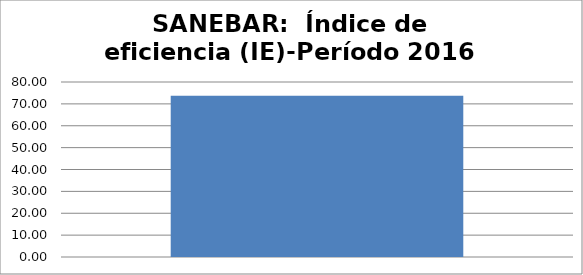
| Category | Índice de eficiencia (IE)  |
|---|---|
| 0 | 73.691 |